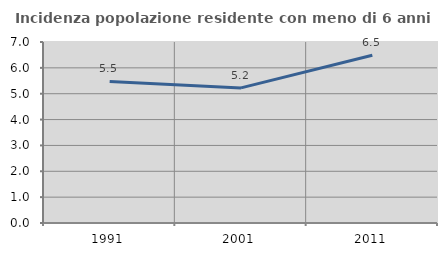
| Category | Incidenza popolazione residente con meno di 6 anni |
|---|---|
| 1991.0 | 5.477 |
| 2001.0 | 5.225 |
| 2011.0 | 6.49 |